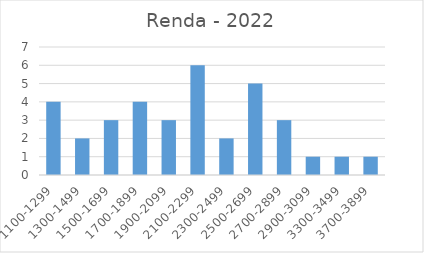
| Category | Series 0 |
|---|---|
| 1100-1299 | 4 |
| 1300-1499 | 2 |
| 1500-1699 | 3 |
| 1700-1899 | 4 |
| 1900-2099 | 3 |
| 2100-2299 | 6 |
| 2300-2499 | 2 |
| 2500-2699 | 5 |
| 2700-2899 | 3 |
| 2900-3099 | 1 |
| 3300-3499 | 1 |
| 3700-3899 | 1 |